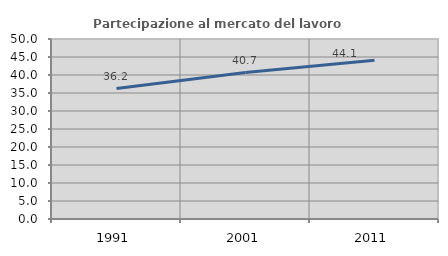
| Category | Partecipazione al mercato del lavoro  femminile |
|---|---|
| 1991.0 | 36.247 |
| 2001.0 | 40.677 |
| 2011.0 | 44.128 |